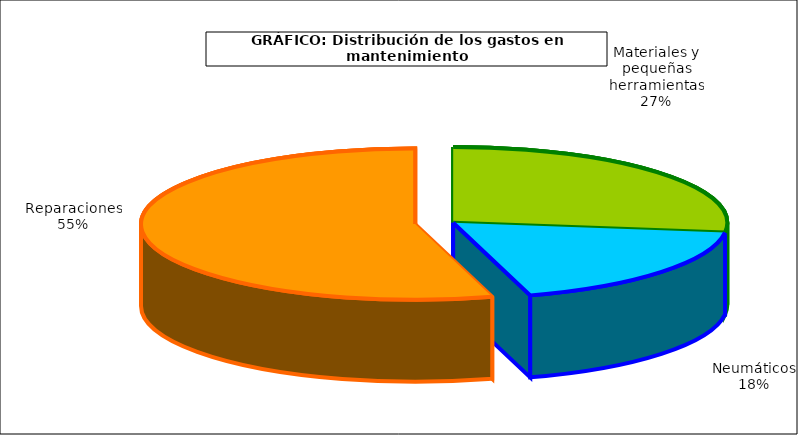
| Category | Series 0 |
|---|---|
| 0 | 423.88 |
| 1 | 288.653 |
| 2 | 854.713 |